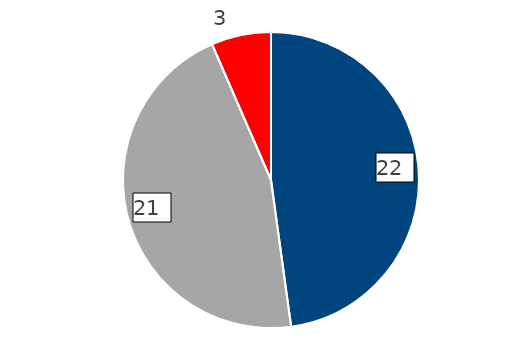
| Category | 2022 |
|---|---|
| E-mail a Transparencia CORREOS | 22 |
| Portal Transparencia AGE | 21 |
| Registro general CORREOS | 3 |